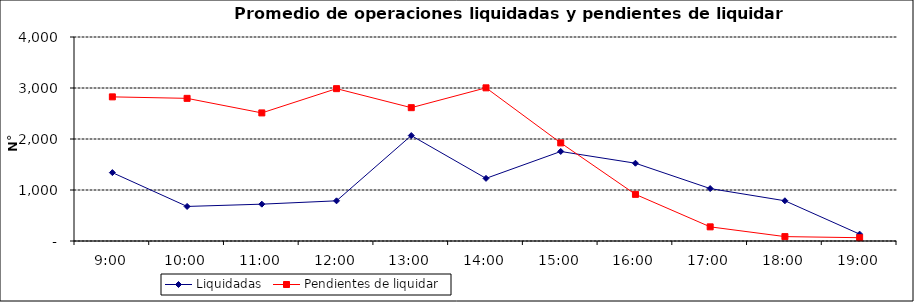
| Category | Liquidadas | Pendientes de liquidar |
|---|---|---|
| 0.375 | 1340.85 | 2826.15 |
| 0.4166666666666667 | 677.6 | 2797.15 |
| 0.4583333333333333 | 722.15 | 2511.5 |
| 0.5 | 787.75 | 2987.2 |
| 0.5416666666666666 | 2067.55 | 2614.1 |
| 0.5833333333333334 | 1228.15 | 3003.35 |
| 0.625 | 1755.4 | 1923.3 |
| 0.6666666666666666 | 1524.85 | 914.5 |
| 0.7083333333333334 | 1028.15 | 277.4 |
| 0.75 | 788.9 | 86.15 |
| 0.7916666666666666 | 134.5 | 64.4 |